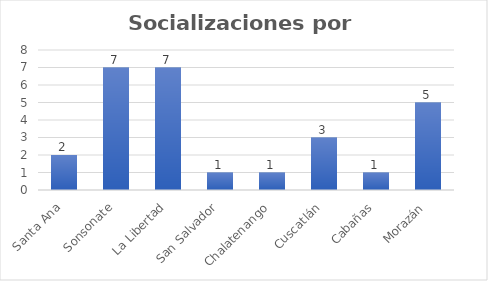
| Category | Socializaciones |
|---|---|
| Santa Ana | 2 |
| Sonsonate | 7 |
| La Libertad | 7 |
| San Salvador | 1 |
| Chalatenango | 1 |
| Cuscatlán | 3 |
| Cabañas | 1 |
| Morazán | 5 |